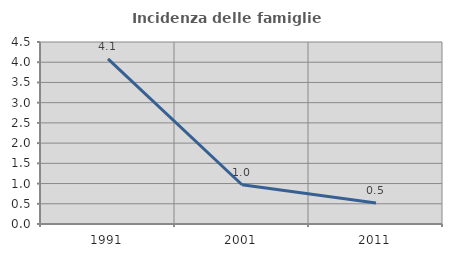
| Category | Incidenza delle famiglie numerose |
|---|---|
| 1991.0 | 4.082 |
| 2001.0 | 0.971 |
| 2011.0 | 0.518 |